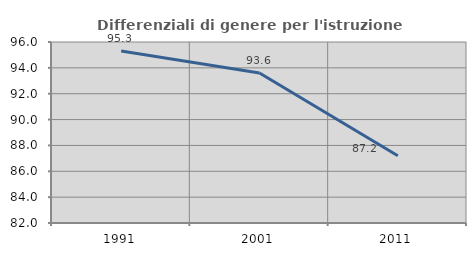
| Category | Differenziali di genere per l'istruzione superiore |
|---|---|
| 1991.0 | 95.306 |
| 2001.0 | 93.606 |
| 2011.0 | 87.2 |